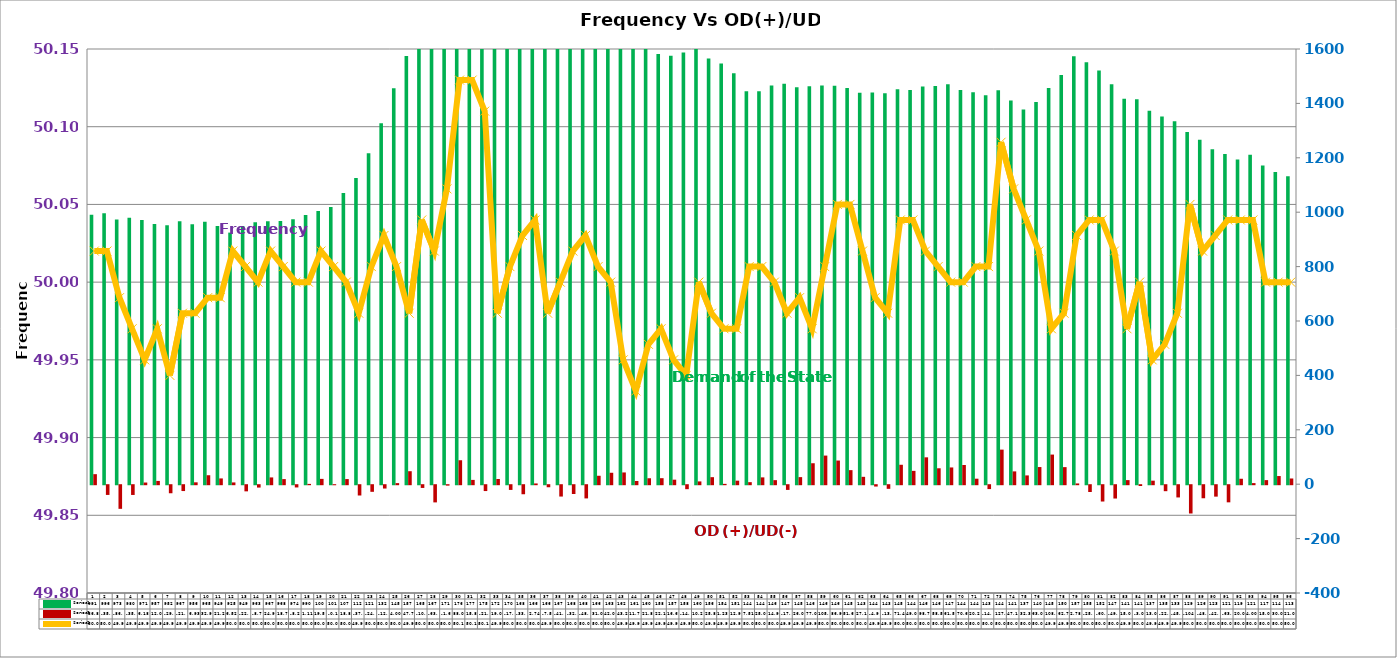
| Category | Series 2 | Series 4 |
|---|---|---|
| 0 | 991 | 36.875 |
| 1 | 996 | -35.762 |
| 2 | 973 | -86.887 |
| 3 | 980 | -35.887 |
| 4 | 971 | 6.183 |
| 5 | 957 | 12.022 |
| 6 | 952 | -29.621 |
| 7 | 967 | -21.518 |
| 8 | 956 | 6.927 |
| 9 | 965 | 32.969 |
| 10 | 949 | 21.217 |
| 11 | 925 | 6.522 |
| 12 | 949 | -22.589 |
| 13 | 963 | -8.729 |
| 14 | 967 | 24.924 |
| 15 | 968 | 18.746 |
| 16 | 974 | -8.258 |
| 17 | 990 | 1.105 |
| 18 | 1004 | 19.582 |
| 19 | 1019 | -0.193 |
| 20 | 1071 | 18.861 |
| 21 | 1126 | -37.855 |
| 22 | 1217 | -24.331 |
| 23 | 1327 | -12.266 |
| 24 | 1456 | 4.003 |
| 25 | 1574 | 47.751 |
| 26 | 1655 | -10.076 |
| 27 | 1672 | -63.215 |
| 28 | 1712 | -1.608 |
| 29 | 1760 | 88.063 |
| 30 | 1778 | 15.818 |
| 31 | 1752 | -21.511 |
| 32 | 1728 | 19.041 |
| 33 | 1703 | -17.344 |
| 34 | 1686 | -33.267 |
| 35 | 1669 | 2.74 |
| 36 | 1664 | -7.567 |
| 37 | 1672 | -41.734 |
| 38 | 1686 | -32.364 |
| 39 | 1681 | -48.575 |
| 40 | 1661 | 31.014 |
| 41 | 1638 | 42.056 |
| 42 | 1626 | 43.206 |
| 43 | 1611 | 11.792 |
| 44 | 1600 | 21.852 |
| 45 | 1582 | 22.126 |
| 46 | 1575 | 16.615 |
| 47 | 1587 | -14.649 |
| 48 | 1605 | 10.235 |
| 49 | 1565 | 25.848 |
| 50 | 1547 | 1.23 |
| 51 | 1511 | 12.954 |
| 52 | 1445 | 7.51 |
| 53 | 1445 | 25.078 |
| 54 | 1466 | 14.911 |
| 55 | 1472 | -17.295 |
| 56 | 1459 | 26.026 |
| 57 | 1463 | 77.051 |
| 58 | 1466 | 105.214 |
| 59 | 1465 | 86.956 |
| 60 | 1457 | 51.688 |
| 61 | 1439 | 27.107 |
| 62 | 1440 | -4.942 |
| 63 | 1437 | -13.328 |
| 64 | 1452 | 71.434 |
| 65 | 1449 | 49.025 |
| 66 | 1462 | 98.783 |
| 67 | 1464 | 58.523 |
| 68 | 1470 | 61.588 |
| 69 | 1449 | 70.622 |
| 70 | 1441 | 20.219 |
| 71 | 1430 | -14.267 |
| 72 | 1448 | 127.114 |
| 73 | 1411 | 47.107 |
| 74 | 1378 | 32.312 |
| 75 | 1405 | 63.065 |
| 76 | 1457 | 108.902 |
| 77 | 1504 | 62.752 |
| 78 | 1573 | 2.78 |
| 79 | 1551 | -25 |
| 80 | 1521 | -60 |
| 81 | 1470 | -49 |
| 82 | 1417 | 15 |
| 83 | 1415 | -3 |
| 84 | 1373 | 13 |
| 85 | 1352 | -22 |
| 86 | 1334 | -45 |
| 87 | 1295 | -104 |
| 88 | 1266 | -48 |
| 89 | 1231 | -42 |
| 90 | 1214 | -63 |
| 91 | 1194 | 20 |
| 92 | 1211 | 4 |
| 93 | 1172 | 15 |
| 94 | 1148 | 30 |
| 95 | 1132 | 21 |